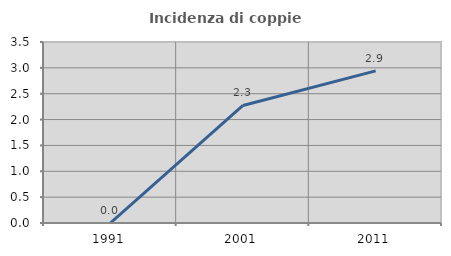
| Category | Incidenza di coppie miste |
|---|---|
| 1991.0 | 0 |
| 2001.0 | 2.273 |
| 2011.0 | 2.941 |